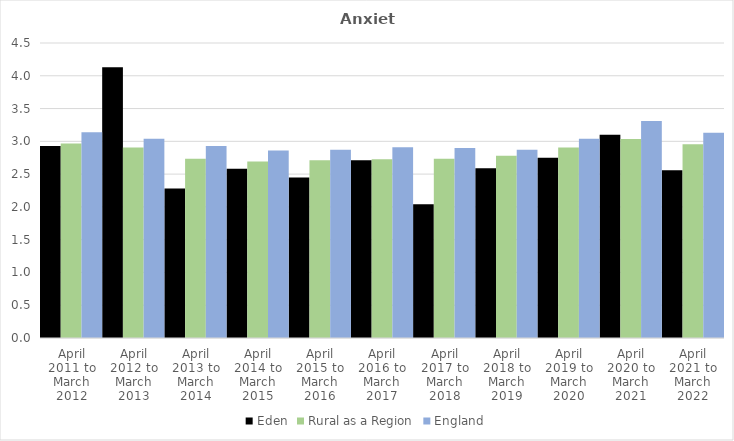
| Category | Eden | Rural as a Region | England |
|---|---|---|---|
| April 2011 to March 2012 | 2.93 | 2.967 | 3.14 |
| April 2012 to March 2013 | 4.13 | 2.904 | 3.04 |
| April 2013 to March 2014 | 2.28 | 2.734 | 2.93 |
| April 2014 to March 2015 | 2.58 | 2.691 | 2.86 |
| April 2015 to March 2016 | 2.45 | 2.711 | 2.87 |
| April 2016 to March 2017 | 2.71 | 2.729 | 2.91 |
| April 2017 to March 2018 | 2.04 | 2.736 | 2.9 |
| April 2018 to March 2019 | 2.59 | 2.78 | 2.87 |
| April 2019 to March 2020 | 2.75 | 2.908 | 3.04 |
| April 2020 to March 2021 | 3.1 | 3.036 | 3.31 |
| April 2021 to March 2022 | 2.56 | 2.956 | 3.13 |